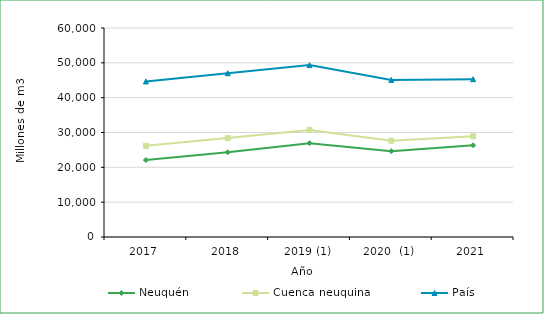
| Category | Neuquén | Cuenca neuquina | País |
|---|---|---|---|
| 2017 | 22077.047 | 26177.45 | 44656.659 |
| 2018 | 24317.966 | 28394.05 | 47021.206 |
| 2019 (1) | 26914.937 | 30736.179 | 49350.483 |
| 2020  (1) | 24645.292 | 27653.989 | 45100.229 |
| 2021 | 26335.796 | 28914.547 | 45305.481 |